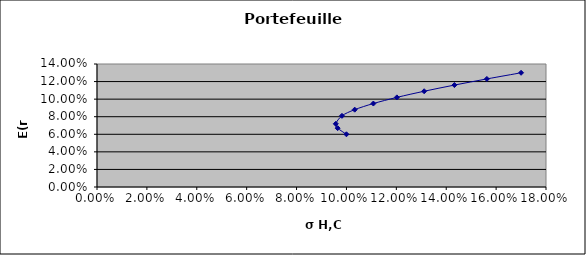
| Category | E(r H,C) |
|---|---|
| 0.1 | 0.06 |
| 0.09647279409242795 | 0.067 |
| 0.0957257260831504 | 0.072 |
| 0.09819877799647 | 0.081 |
| 0.10330537256115968 | 0.088 |
| 0.1107925990308017 | 0.095 |
| 0.12021647141718976 | 0.102 |
| 0.13116020738013492 | 0.109 |
| 0.14327595750857858 | 0.116 |
| 0.15629139451678076 | 0.123 |
| 0.17 | 0.13 |